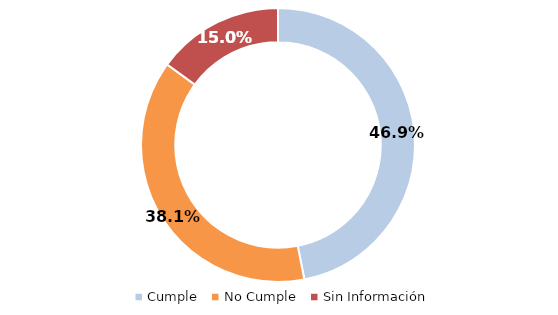
| Category | Series 0 |
|---|---|
| Cumple | 0.469 |
| No Cumple | 0.381 |
| Sin Información | 0.15 |